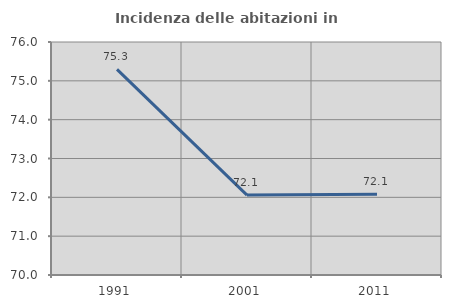
| Category | Incidenza delle abitazioni in proprietà  |
|---|---|
| 1991.0 | 75.294 |
| 2001.0 | 72.059 |
| 2011.0 | 72.081 |